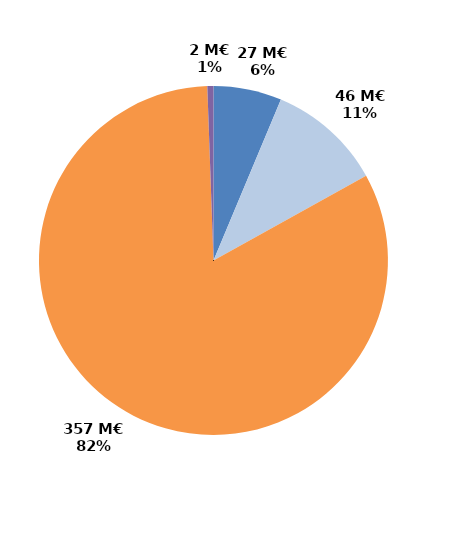
| Category | Series 0 |
|---|---|
| CIF - CPF | 27.305 |
| Période de professionnalisation | 45.936 |
| Plan de formation | 356.759 |
| Autres | 2.453 |